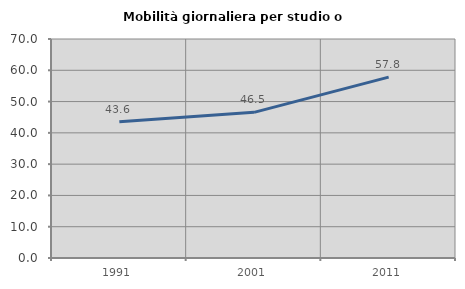
| Category | Mobilità giornaliera per studio o lavoro |
|---|---|
| 1991.0 | 43.568 |
| 2001.0 | 46.548 |
| 2011.0 | 57.829 |